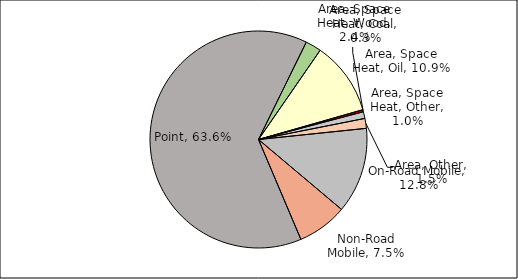
| Category | Series 0 |
|---|---|
| Point | 0.636 |
| Area, Space Heat, Wood | 0.024 |
| Area, Space Heat, Oil | 0.109 |
| Area, Space Heat, Coal | 0.003 |
| Area, Space Heat, Other | 0.01 |
| Area, Other | 0.015 |
| On-Road Mobile | 0.128 |
| Non-Road Mobile | 0.075 |